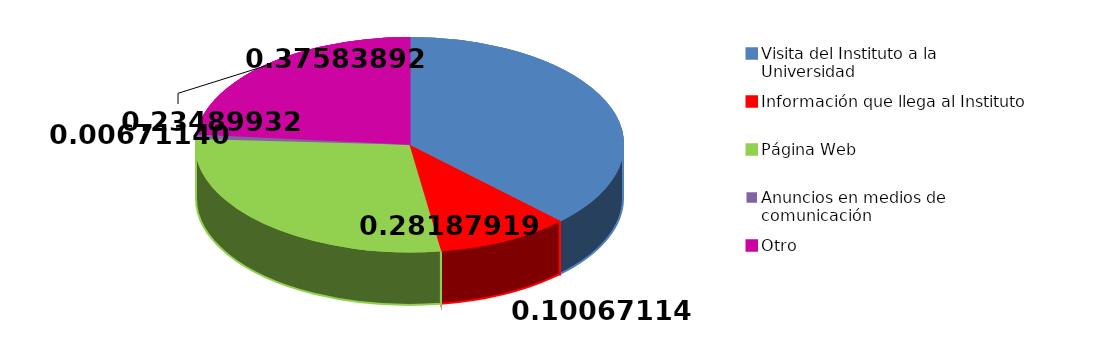
| Category | Sí | No |
|---|---|---|
| Visita del Instituto a la Universidad | 56 | 96 |
| Información que llega al Instituto | 15 | 97 |
| Página Web | 42 | 98 |
| Anuncios en medios de comunicación | 1 | 99 |
| Otro | 35 | 100 |